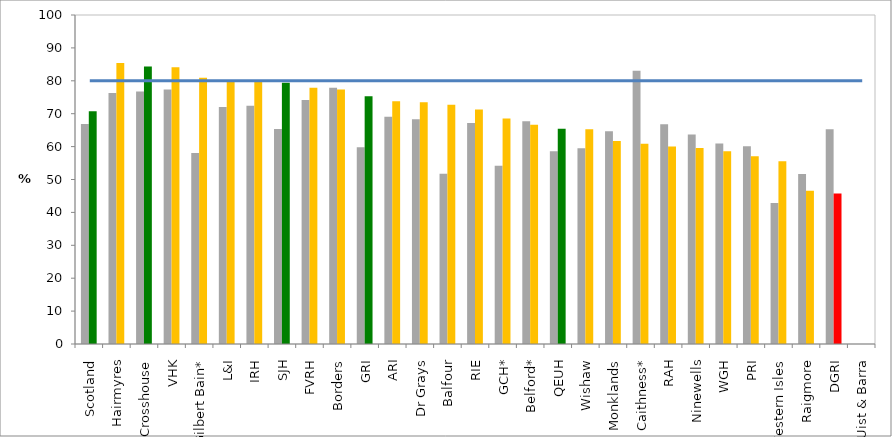
| Category | 2016 (%) | 2017 (%) |
|---|---|---|
| Scotland | 66.836 | 70.782 |
| Hairmyres | 76.289 | 85.388 |
| Crosshouse | 76.747 | 84.332 |
| VHK | 77.358 | 84.091 |
| Gilbert Bain* | 58.065 | 80.952 |
| L&I | 72 | 80 |
| IRH | 72.388 | 79.661 |
| SJH | 65.341 | 79.381 |
| FVRH | 74.169 | 77.892 |
| Borders | 77.907 | 77.372 |
| GRI | 59.768 | 75.29 |
| ARI | 69.106 | 73.805 |
| Dr Grays | 68.317 | 73.469 |
| Balfour | 51.724 | 72.727 |
| RIE | 67.19 | 71.242 |
| GCH* | 54.167 | 68.571 |
| Belford* | 67.742 | 66.667 |
| QEUH | 58.549 | 65.451 |
| Wishaw | 59.535 | 65.306 |
| Monklands | 64.634 | 61.692 |
| Caithness* | 83.019 | 60.87 |
| RAH | 66.786 | 60.056 |
| Ninewells | 63.662 | 59.58 |
| WGH | 60.938 | 58.549 |
| PRI | 60.127 | 57.037 |
| Western Isles | 42.857 | 55.556 |
| Raigmore | 51.648 | 46.575 |
| DGRI | 65.278 | 45.714 |
| Uist & Barra | 0 | 0 |